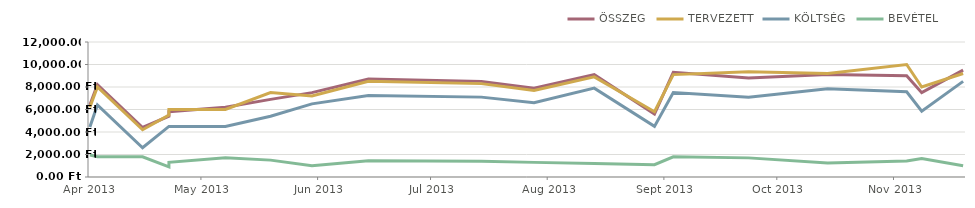
| Category | ÖSSZEG | TERVEZETT | KÖLTSÉG | BEVÉTEL |
|---|---|---|---|---|
| 2013-04-23 | 6400 | 6200 | 4450 | 1950 |
| 2013-04-25 | 8200 | 8000 | 6400 | 1800 |
| 2013-05-07 | 4400 | 4200 | 2600 | 1800 |
| 2013-05-14 | 5400 | 5500 | 4500 | 900 |
| 2013-05-14 | 5800 | 6000 | 4500 | 1300 |
| 2013-05-29 | 6200 | 6000 | 4500 | 1700 |
| 2013-06-10 | 6900 | 7500 | 5400 | 1500 |
| 2013-06-21 | 7500 | 7200 | 6500 | 1000 |
| 2013-07-06 | 8700 | 8500 | 7250 | 1450 |
| 2013-08-05 | 8500 | 8300 | 7100 | 1400 |
| 2013-08-19 | 7900 | 7700 | 6600 | 1300 |
| 2013-09-04 | 9100 | 8900 | 7900 | 1200 |
| 2013-09-20 | 5600 | 5800 | 4500 | 1100 |
| 2013-09-25 | 9300 | 9100 | 7500 | 1800 |
| 2013-10-15 | 8800 | 9350 | 7100 | 1700 |
| 2013-11-05 | 9100 | 9200 | 7850 | 1250 |
| 2013-11-26 | 9000 | 10000 | 7575 | 1425 |
| 2013-11-30 | 7500 | 8000 | 5850 | 1650 |
| 2013-12-11 | 9500 | 9200 | 8500 | 1000 |